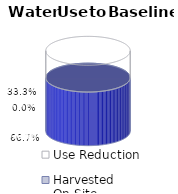
| Category | Net Utility | Harvested On-Site | Use Reduction |
|---|---|---|---|
| 0 | 0.667 | 0 | 0.333 |